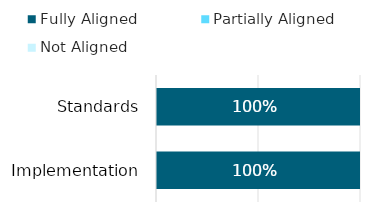
| Category | Fully Aligned | Partially Aligned | Not Aligned |
|---|---|---|---|
| Standards | 1 | 0 | 0 |
| Implementation | 1 | 0 | 0 |